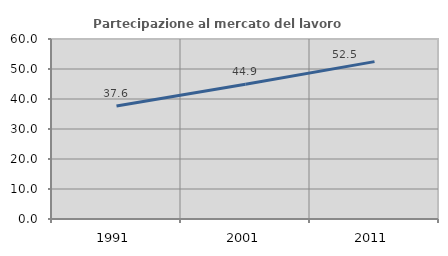
| Category | Partecipazione al mercato del lavoro  femminile |
|---|---|
| 1991.0 | 37.639 |
| 2001.0 | 44.924 |
| 2011.0 | 52.461 |